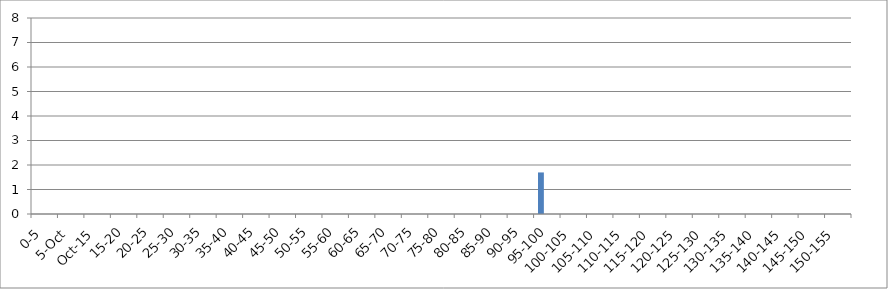
| Category | UNION_ALL | INTERSECTION_ALL | UNION(INTERSECTION_119875_146067,INTERSECTION_119875_241240,INTERSECTION_146067_241240) |
|---|---|---|---|
| 0-5 | 0 | 0 | 0 |
| 5-Oct | 0 | 0 | 0 |
| Oct-15 | 0 | 0 | 0 |
| 15-20 | 0 | 0 | 0 |
| 20-25 | 0 | 0 | 0 |
| 25-30 | 0 | 0 | 0 |
| 30-35 | 0 | 0 | 0 |
| 35-40 | 0 | 0 | 0 |
| 40-45 | 0 | 0 | 0 |
| 45-50 | 0 | 0 | 0 |
| 50-55 | 0 | 0 | 0 |
| 55-60 | 0 | 0 | 0 |
| 60-65 | 0 | 0 | 0 |
| 65-70 | 0 | 0 | 0 |
| 70-75 | 0 | 0 | 0 |
| 75-80 | 0 | 0 | 0 |
| 80-85 | 0 | 0 | 0 |
| 85-90 | 0 | 0 | 0 |
| 90-95 | 0 | 0 | 0 |
| 95-100 | 1.696 | 0 | 0 |
| 100-105 | 0 | 0 | 0 |
| 105-110 | 0 | 0 | 0 |
| 110-115 | 0 | 0 | 0 |
| 115-120 | 0 | 0 | 0 |
| 120-125 | 0 | 0 | 0 |
| 125-130 | 0 | 0 | 0 |
| 130-135 | 0 | 0 | 0 |
| 135-140 | 0 | 0 | 0 |
| 140-145 | 0 | 0 | 0 |
| 145-150 | 0 | 0 | 0 |
| 150-155 | 0 | 0 | 0 |